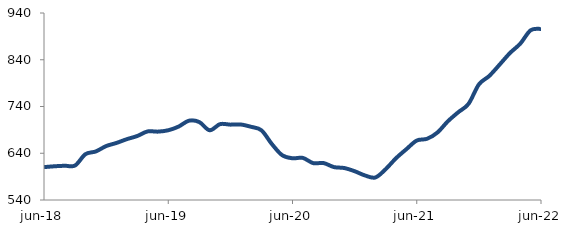
| Category | Series 0 |
|---|---|
| 2018-06-01 | 610.334 |
| 2018-07-01 | 612.121 |
| 2018-08-01 | 613.247 |
| 2018-09-01 | 613.821 |
| 2018-10-01 | 638.011 |
| 2018-11-01 | 643.807 |
| 2018-12-01 | 655.34 |
| 2019-01-01 | 662.041 |
| 2019-02-01 | 670.134 |
| 2019-03-01 | 676.827 |
| 2019-04-01 | 686.669 |
| 2019-05-01 | 686.255 |
| 2019-06-01 | 689.181 |
| 2019-07-01 | 697.076 |
| 2019-08-01 | 709.635 |
| 2019-09-01 | 706.734 |
| 2019-10-01 | 689.137 |
| 2019-11-01 | 702.277 |
| 2019-12-01 | 701.214 |
| 2020-01-01 | 701.517 |
| 2020-02-01 | 696.552 |
| 2020-03-01 | 689.099 |
| 2020-04-01 | 659.896 |
| 2020-05-01 | 635.894 |
| 2020-06-01 | 629.29 |
| 2020-07-01 | 629.994 |
| 2020-08-01 | 618.866 |
| 2020-09-01 | 619.022 |
| 2020-10-01 | 610.428 |
| 2020-11-01 | 608.402 |
| 2020-12-01 | 601.605 |
| 2021-01-01 | 592.504 |
| 2021-02-01 | 588.185 |
| 2021-03-01 | 605.989 |
| 2021-04-01 | 629.446 |
| 2021-05-01 | 648.73 |
| 2021-06-01 | 667.177 |
| 2021-07-01 | 670.996 |
| 2021-08-01 | 684.389 |
| 2021-09-01 | 708.308 |
| 2021-10-01 | 727.608 |
| 2021-11-01 | 745.65 |
| 2021-12-01 | 787.184 |
| 2022-01-01 | 805.308 |
| 2022-02-01 | 829.502 |
| 2022-03-01 | 854.336 |
| 2022-04-01 | 874.453 |
| 2022-05-01 | 903.049 |
| 2022-06-01 | 906.022 |